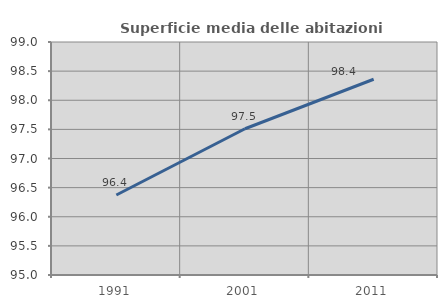
| Category | Superficie media delle abitazioni occupate |
|---|---|
| 1991.0 | 96.373 |
| 2001.0 | 97.511 |
| 2011.0 | 98.361 |